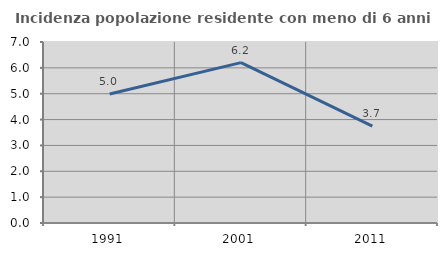
| Category | Incidenza popolazione residente con meno di 6 anni |
|---|---|
| 1991.0 | 4.989 |
| 2001.0 | 6.203 |
| 2011.0 | 3.746 |